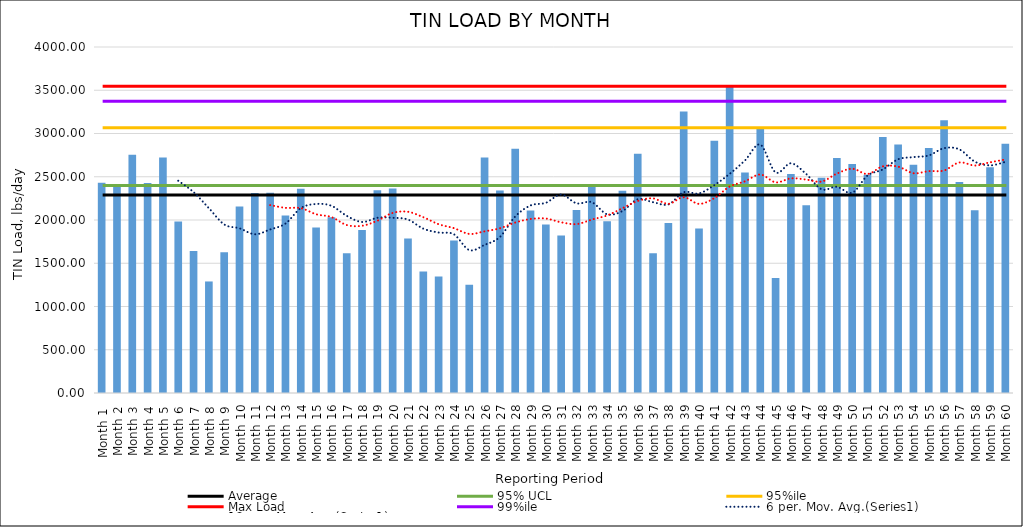
| Category | Series 0 |
|---|---|
| Month 1  | 2430.009 |
| Month 2 | 2406.339 |
| Month 3 | 2754.952 |
| Month 4 | 2427.259 |
| Month 5 | 2721.676 |
| Month 6 | 1983.205 |
| Month 7 | 1642.767 |
| Month 8 | 1289.461 |
| Month 9 | 1627.182 |
| Month 10 | 2156.844 |
| Month 11 | 2312.057 |
| Month 12 | 2313.961 |
| Month 13 | 2052.129 |
| Month 14 | 2361.197 |
| Month 15 | 1913.329 |
| Month 16 | 2032.061 |
| Month 17 | 1616.447 |
| Month 18 | 1884.459 |
| Month 19 | 2342.993 |
| Month 20 | 2365.171 |
| Month 21 | 1787.496 |
| Month 22 | 1403.997 |
| Month 23 | 1345.582 |
| Month 24 | 1763.108 |
| Month 25 | 1250.329 |
| Month 26 | 2721.159 |
| Month 27 | 2339.89 |
| Month 28 | 2823.127 |
| Month 29 | 2111.188 |
| Month 30 | 1948.818 |
| Month 31 | 1820.455 |
| Month 32 | 2116.445 |
| Month 33 | 2413.065 |
| Month 34 | 1985.487 |
| Month 35 | 2337.706 |
| Month 36 | 2765.242 |
| Month 37 | 1615.958 |
| Month 38 | 1965.158 |
| Month 39 | 3254.15 |
| Month 40 | 1903.074 |
| Month 41 | 2915.313 |
| Month 42 | 3546.147 |
| Month 43 | 2547.755 |
| Month 44 | 3060.848 |
| Month 45 | 1329.444 |
| Month 46 | 2532.715 |
| Month 47 | 2171.745 |
| Month 48 | 2489.342 |
| Month 49 | 2717.495 |
| Month 50 | 2647.254 |
| Month 51 | 2524.03 |
| Month 52 | 2958.2 |
| Month 53 | 2874.193 |
| Month 54 | 2640.034 |
| Month 55 | 2831.11 |
| Month 56 | 3154.396 |
| Month 57 | 2439.835 |
| Month 58 | 2113.543 |
| Month 59 | 2610.935 |
| Month 60 | 2882.656 |